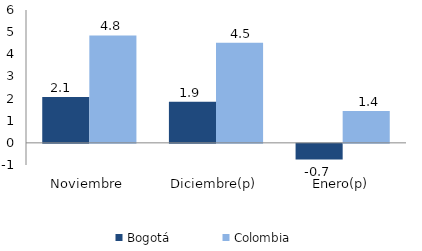
| Category | Bogotá | Colombia |
|---|---|---|
| Noviembre | 2.069 | 4.85 |
| Diciembre(p) | 1.858 | 4.522 |
| Enero(p) | -0.704 | 1.444 |